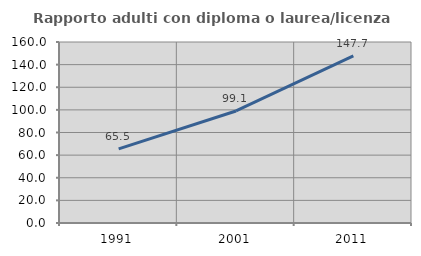
| Category | Rapporto adulti con diploma o laurea/licenza media  |
|---|---|
| 1991.0 | 65.541 |
| 2001.0 | 99.052 |
| 2011.0 | 147.679 |